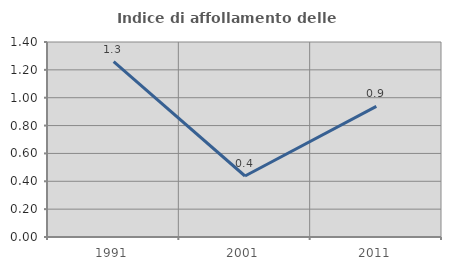
| Category | Indice di affollamento delle abitazioni  |
|---|---|
| 1991.0 | 1.259 |
| 2001.0 | 0.438 |
| 2011.0 | 0.938 |